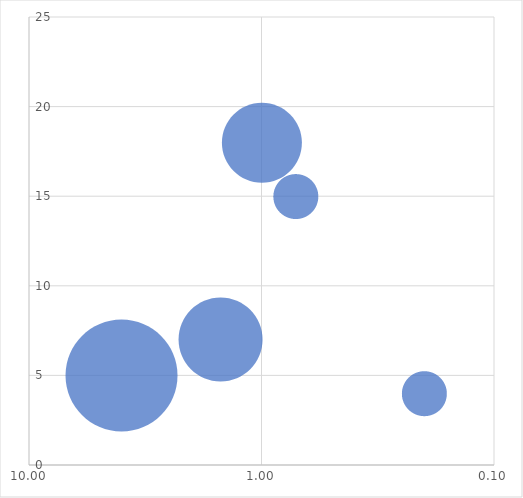
| Category | Participación relativa |
|---|---|
| 0.7142857142857143 | 15 |
| 1.0 | 18 |
| 1.5 | 7 |
| 4.0 | 5 |
| 0.2 | 4 |